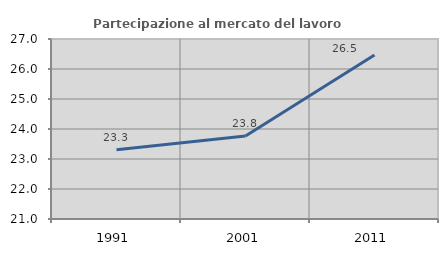
| Category | Partecipazione al mercato del lavoro  femminile |
|---|---|
| 1991.0 | 23.308 |
| 2001.0 | 23.764 |
| 2011.0 | 26.465 |